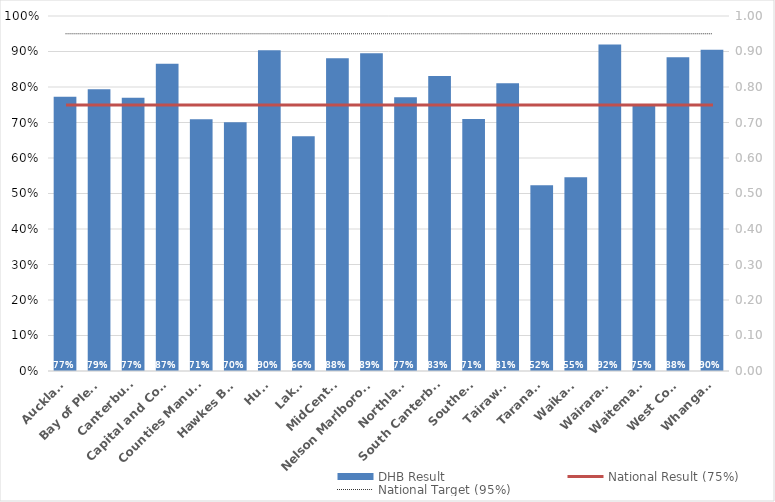
| Category | DHB Result |
|---|---|
| Auckland | 0.772 |
| Bay of Plenty | 0.794 |
| Canterbury | 0.77 |
| Capital and Coast | 0.866 |
| Counties Manukau | 0.709 |
| Hawkes Bay | 0.7 |
| Hutt | 0.904 |
| Lakes | 0.662 |
| MidCentral | 0.881 |
| Nelson Marlborough | 0.895 |
| Northland | 0.771 |
| South Canterbury | 0.831 |
| Southern | 0.71 |
| Tairawhiti | 0.811 |
| Taranaki | 0.524 |
| Waikato | 0.546 |
| Wairarapa | 0.92 |
| Waitemata | 0.749 |
| West Coast | 0.883 |
| Whanganui | 0.905 |